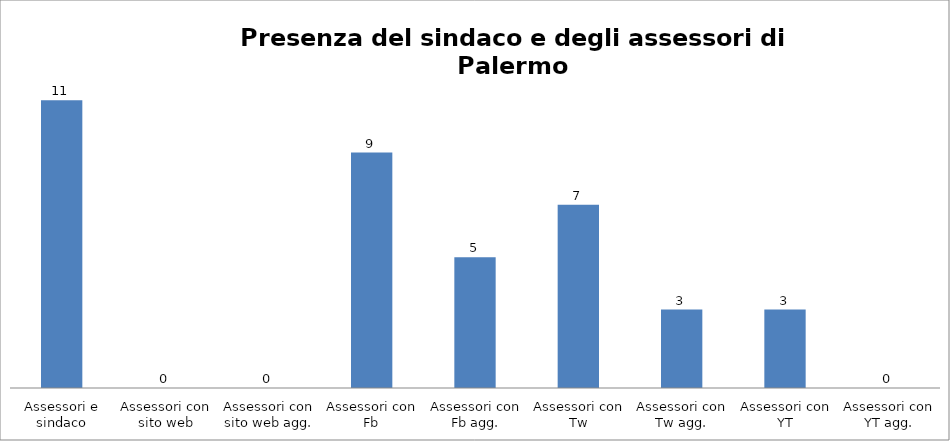
| Category | Series 0 |
|---|---|
| Assessori e sindaco | 11 |
| Assessori con sito web | 0 |
| Assessori con sito web agg. | 0 |
| Assessori con Fb | 9 |
| Assessori con Fb agg. | 5 |
| Assessori con Tw | 7 |
| Assessori con Tw agg. | 3 |
| Assessori con YT | 3 |
| Assessori con YT agg. | 0 |